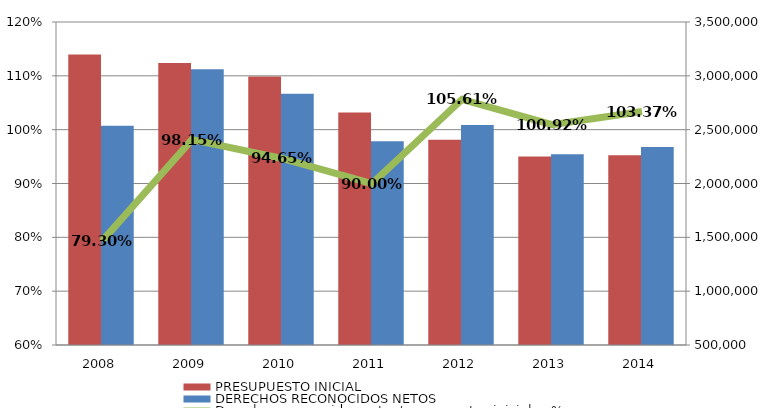
| Category | PRESUPUESTO INICIAL | DERECHOS RECONOCIDOS NETOS |
|---|---|---|
| 2008.0 | 3197713.361 | 2535924.87 |
| 2009.0 | 3119192.039 | 3061409.44 |
| 2010.0 | 2993809.334 | 2833638.064 |
| 2011.0 | 2658404.732 | 2392480.632 |
| 2012.0 | 2407218.064 | 2542189.167 |
| 2013.0 | 2251494.132 | 2272108.92 |
| 2014.0 | 2262738.711 | 2338899.754 |